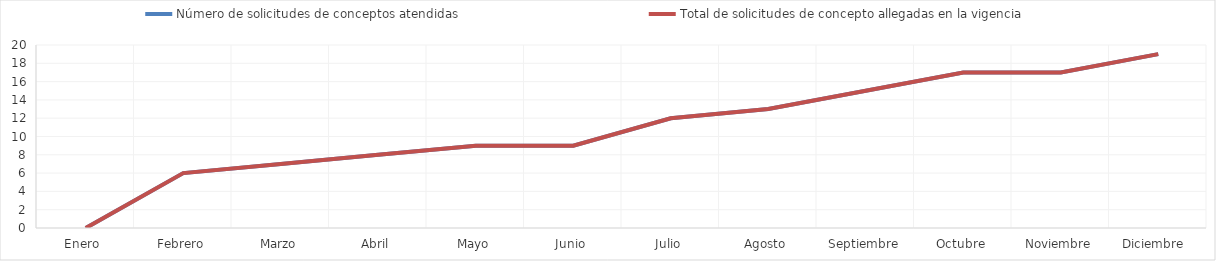
| Category | Número de solicitudes de conceptos atendidas | Total de solicitudes de concepto allegadas en la vigencia |
|---|---|---|
| Enero  | 0 | 0 |
| Febrero | 6 | 6 |
| Marzo | 7 | 7 |
| Abril | 8 | 8 |
| Mayo | 9 | 9 |
| Junio | 9 | 9 |
| Julio | 12 | 12 |
| Agosto | 13 | 13 |
| Septiembre | 15 | 15 |
| Octubre | 17 | 17 |
| Noviembre | 17 | 17 |
| Diciembre  | 19 | 19 |